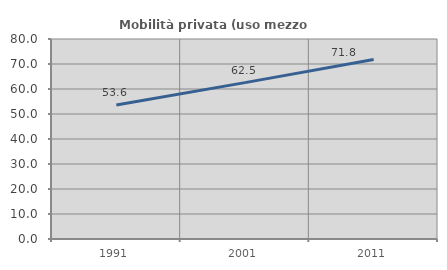
| Category | Mobilità privata (uso mezzo privato) |
|---|---|
| 1991.0 | 53.641 |
| 2001.0 | 62.55 |
| 2011.0 | 71.808 |